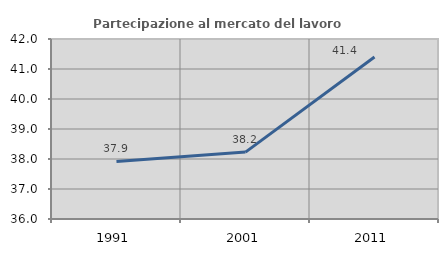
| Category | Partecipazione al mercato del lavoro  femminile |
|---|---|
| 1991.0 | 37.92 |
| 2001.0 | 38.229 |
| 2011.0 | 41.398 |